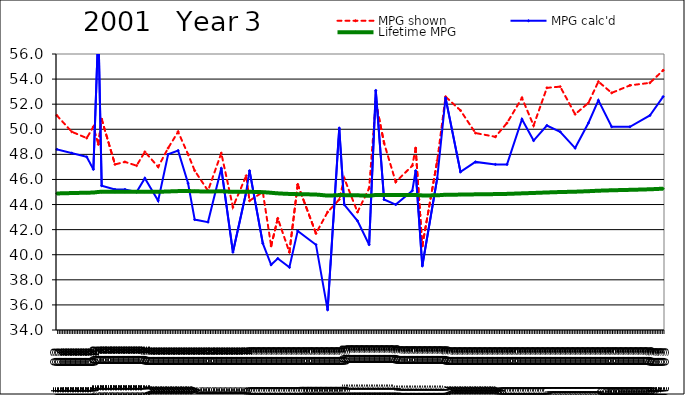
| Category | MPG shown | MPG calc'd | Lifetime MPG |
|---|---|---|---|
| 2002-09-08 | 51.1 | 48.4 | 44.883 |
| 2002-09-17 | 49.8 | 48.1 | 44.916 |
| 2002-09-26 | 49.3 | 47.8 | 44.944 |
| 2002-09-30 | 50.2 | 46.8 | 44.958 |
| 2002-10-03 | 48.8 | 58.1 | 45.005 |
| 2002-10-05 | 50.8 | 45.5 | 45.01 |
| 2002-10-13 | 47.2 | 45.2 | 45.012 |
| 2002-10-19 | 47.4 | 45.2 | 45.014 |
| 2002-10-26 | 47.1 | 45 | 45.014 |
| 2002-10-31 | 48.2 | 46.1 | 45.023 |
| 2002-11-08 | 47 | 44.3 | 45.017 |
| 2002-11-14 | 48.5 | 48 | 45.042 |
| 2002-11-20 | 49.8 | 48.3 | 45.07 |
| 2002-11-26 | 48 | 45.7 | 45.076 |
| 2002-11-30 | 46.7 | 42.8 | 45.059 |
| 2002-12-08 | 45.1 | 42.6 | 45.039 |
| 2002-12-16 | 48.1 | 46.9 | 45.054 |
| 2002-12-23 | 43.8 | 40.2 | 45.013 |
| 2002-12-31 | 46.3 | 45 | 45.013 |
| 2003-01-02 | 44.3 | 46.7 | 45.019 |
| 2003-01-10 | 45 | 40.9 | 44.986 |
| 2003-01-15 | 40.7 | 39.2 | 44.938 |
| 2003-01-19 | 42.9 | 39.7 | 44.892 |
| 2003-01-26 | 40.2 | 39 | 44.846 |
| 2003-01-31 | 45.6 | 41.9 | 44.826 |
| 2003-02-11 | 41.7 | 40.8 | 44.796 |
| 2003-02-18 | 43.4 | 35.6 | 44.719 |
| 2003-02-25 | 44.4 | 50.1 | 44.754 |
| 2003-02-28 | 46.1 | 44 | 44.751 |
| 2003-03-08 | 43.4 | 42.7 | 44.736 |
| 2003-03-15 | 45.3 | 40.8 | 44.705 |
| 2003-03-19 | 52.2 | 53.1 | 44.761 |
| 2003-03-24 | 48.9 | 44.4 | 44.758 |
| 2003-03-31 | 45.8 | 44 | 44.753 |
| 2003-04-10 | 47.1 | 45.1 | 44.756 |
| 2003-04-12 | 48.5 | 46.7 | 44.764 |
| 2003-04-16 | 40.7 | 39.1 | 44.729 |
| 2003-04-25 | 47.5 | 46.1 | 44.74 |
| 2003-04-30 | 52.6 | 52.5 | 44.779 |
| 2003-05-09 | 51.5 | 46.6 | 44.793 |
| 2003-05-18 | 49.7 | 47.4 | 44.813 |
| 2003-05-30 | 49.4 | 47.2 | 44.833 |
| 2003-06-06 | 50.5 | 47.2 | 44.851 |
| 2003-06-15 | 52.5 | 50.8 | 44.892 |
| 2003-06-22 | 50.3 | 49.1 | 44.924 |
| 2003-06-30 | 53.3 | 50.3 | 44.962 |
| 2003-07-08 | 53.4 | 49.8 | 44.997 |
| 2003-07-17 | 51.2 | 48.5 | 45.025 |
| 2003-07-25 | 52.1 | 50.5 | 45.064 |
| 2003-07-31 | 53.8 | 52.3 | 45.103 |
| 2003-08-08 | 52.9 | 50.2 | 45.137 |
| 2003-08-19 | 53.5 | 50.2 | 45.172 |
| 2003-08-31 | 53.7 | 51.1 | 45.216 |
| 2003-09-08 | 54.7 | 52.6 | 45.266 |